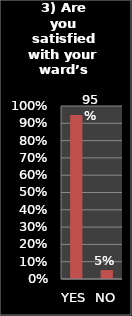
| Category | Series 0 |
|---|---|
| YES | 0.948 |
| NO | 0.052 |